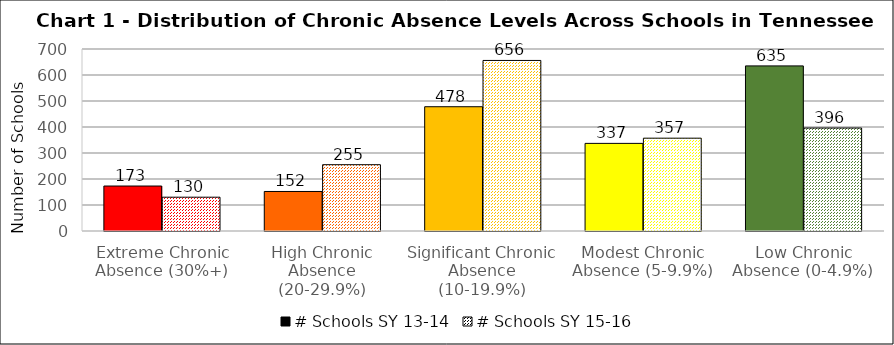
| Category | # Schools SY 13-14 | # Schools SY 15-16 |
|---|---|---|
| Extreme Chronic Absence (30%+) | 173 | 130 |
| High Chronic Absence (20-29.9%) | 152 | 255 |
| Significant Chronic Absence (10-19.9%) | 478 | 656 |
| Modest Chronic Absence (5-9.9%) | 337 | 357 |
| Low Chronic Absence (0-4.9%) | 635 | 396 |